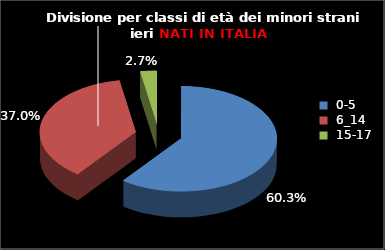
| Category | Series 0 |
|---|---|
| 0-5 | 44 |
| 6_14 | 27 |
| 15-17 | 2 |